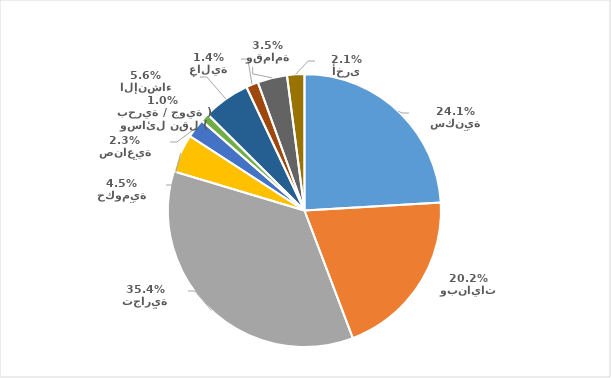
| Category | Series 0 |
|---|---|
| منشآت سكنية | 117 |
| شقق وبنايات | 98 |
| منشآت تجارية | 172 |
| منشآت حكومية | 22 |
| منشآت صناعية | 11 |
| وسائل نقل ( بحرية / جوية ) | 5 |
| مباني قيد الإنشاء | 27 |
| أبراج عالية | 7 |
| نفايات وقمامة | 17 |
| مواقع أخرى | 10 |